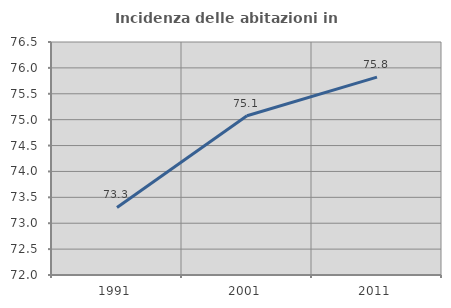
| Category | Incidenza delle abitazioni in proprietà  |
|---|---|
| 1991.0 | 73.306 |
| 2001.0 | 75.075 |
| 2011.0 | 75.821 |